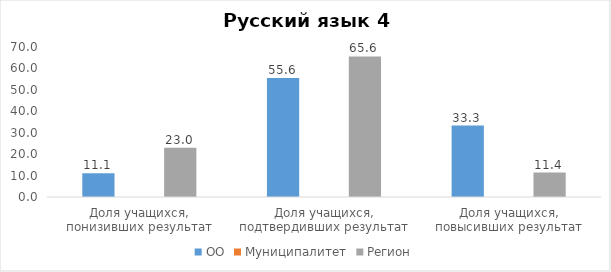
| Category | ОО | Муниципалитет | Регион |
|---|---|---|---|
| Доля учащихся, понизивших результат | 11.11 |  | 23.02 |
| Доля учащихся, подтвердивших результат | 55.56 |  | 65.57 |
| Доля учащихся, повысивших результат | 33.33 |  | 11.4 |